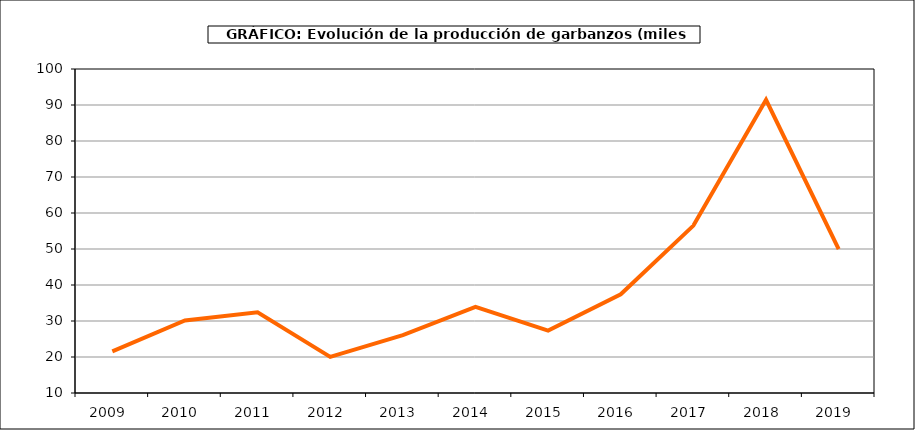
| Category | Superficie |
|---|---|
| 2009.0 | 21.568 |
| 2010.0 | 30.143 |
| 2011.0 | 32.408 |
| 2012.0 | 20.03 |
| 2013.0 | 26.073 |
| 2014.0 | 33.954 |
| 2015.0 | 27.348 |
| 2016.0 | 37.42 |
| 2017.0 | 56.498 |
| 2018.0 | 91.456 |
| 2019.0 | 49.971 |